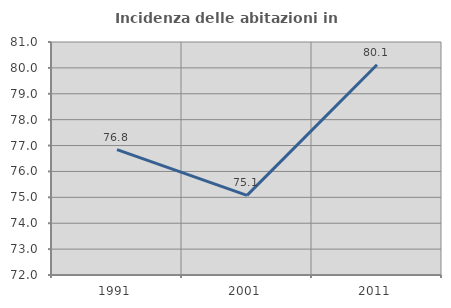
| Category | Incidenza delle abitazioni in proprietà  |
|---|---|
| 1991.0 | 76.843 |
| 2001.0 | 75.074 |
| 2011.0 | 80.121 |